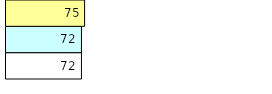
| Category | Total Standouts | Total Recd | Total Tipsters |
|---|---|---|---|
| 0 | 72 | 72 | 75 |